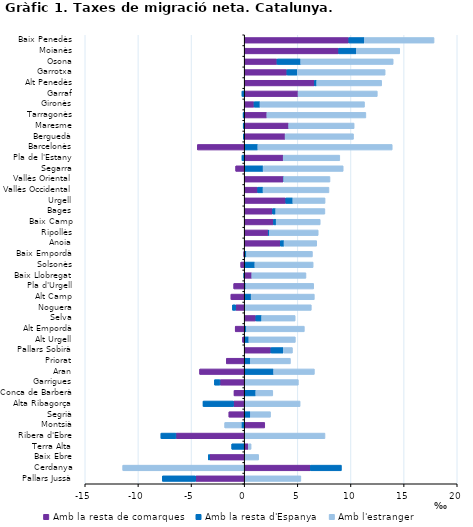
| Category | Amb la resta de comarques | Amb la resta d'Espanya | Amb l'estranger |
|---|---|---|---|
| Baix Penedès | 9.799 | 1.466 | 6.559 |
| Moianès | 8.846 | 1.663 | 4.083 |
| Osona | 3.04 | 2.235 | 8.701 |
| Garrotxa | 3.974 | 0.975 | 8.272 |
| Alt Penedès | 6.563 | 0.216 | 6.113 |
| Garraf | 5.028 | -0.254 | 7.456 |
| Gironès | 0.88 | 0.567 | 9.831 |
| Tarragonès | 2.092 | -0.147 | 9.315 |
| Maresme | 4.143 | -0.139 | 6.16 |
| Berguedà | 3.809 | -0.129 | 6.435 |
| Barcelonès | -4.451 | 1.243 | 12.644 |
| Pla de l'Estany | 3.626 | -0.252 | 5.328 |
| Segarra | -0.847 | 1.739 | 7.535 |
| Vallès Oriental | 3.628 | 0.05 | 4.353 |
| Vallès Occidental | 1.224 | 0.508 | 6.203 |
| Urgell | 3.869 | 0.668 | 3.034 |
| Bages | 2.624 | 0.299 | 4.627 |
| Baix Camp | 2.712 | 0.254 | 4.147 |
| Ripollès | 2.214 | 0.121 | 4.588 |
| Anoia | 3.349 | 0.362 | 3.071 |
| Baix Empordà | -0.084 | 0.175 | 6.204 |
| Solsonès | -0.371 | 0.963 | 5.484 |
| Baix Llobregat | 0.673 | -0.083 | 5.096 |
| Pla d'Urgell | -1.028 | 0.108 | 6.387 |
| Alt Camp | -1.293 | 0.613 | 5.945 |
| Noguera | -0.837 | -0.314 | 6.274 |
| Selva | 1.054 | 0.548 | 3.155 |
| Alt Empordà | -0.891 | 0.168 | 5.45 |
| Alt Urgell | -0.199 | 0.398 | 4.375 |
| Pallars Sobirà | 2.468 | 1.161 | 0.871 |
| Priorat | -1.724 | 0.539 | 3.77 |
| Aran | -4.242 | 2.727 | 3.838 |
| Garrigues | -2.317 | -0.527 | 5.056 |
| Conca de Barberà | -0.999 | 1.049 | 1.599 |
| Alta Ribagorça | -1.044 | -2.872 | 5.222 |
| Segrià | -1.485 | 0.547 | 1.89 |
| Montsià | 1.891 | -0.308 | -1.569 |
| Ribera d'Ebre | -6.461 | -1.421 | 7.561 |
| Terra Alta | 0.348 | -1.217 | 0.261 |
| Baix Ebre | -3.286 | -0.129 | 1.32 |
| Cerdanya | 6.185 | 2.924 | -11.47 |
| Pallars Jussà | -4.601 | -3.144 | 5.291 |